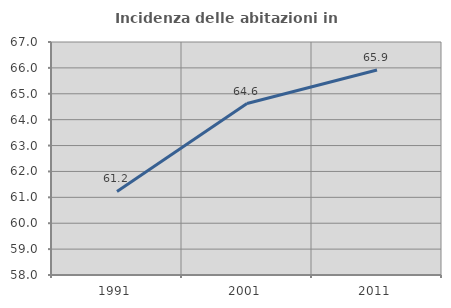
| Category | Incidenza delle abitazioni in proprietà  |
|---|---|
| 1991.0 | 61.227 |
| 2001.0 | 64.623 |
| 2011.0 | 65.92 |